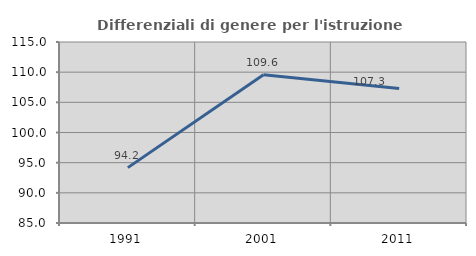
| Category | Differenziali di genere per l'istruzione superiore |
|---|---|
| 1991.0 | 94.179 |
| 2001.0 | 109.583 |
| 2011.0 | 107.304 |